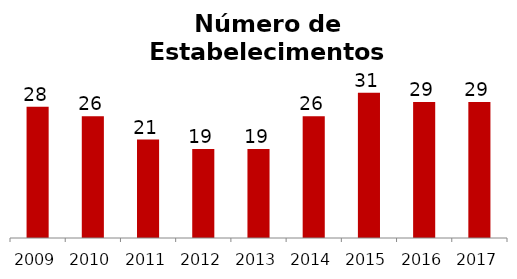
| Category | Cultura e Lazer |
|---|---|
| 2009.0 | 28 |
| 2010.0 | 26 |
| 2011.0 | 21 |
| 2012.0 | 19 |
| 2013.0 | 19 |
| 2014.0 | 26 |
| 2015.0 | 31 |
| 2016.0 | 29 |
| 2017.0 | 29 |